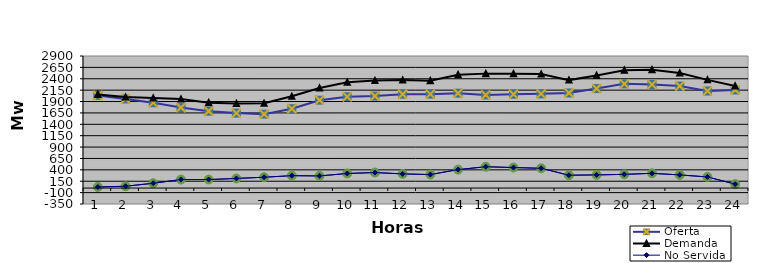
| Category | Oferta | No Servida | Demanda |
|---|---|---|---|
| 1.0 | 2032.75 | 24.325 | 2057.075 |
| 2.0 | 1957.25 | 40.034 | 1997.284 |
| 3.0 | 1873.22 | 105.568 | 1978.788 |
| 4.0 | 1766.88 | 186.701 | 1953.581 |
| 5.0 | 1687.39 | 186.838 | 1874.228 |
| 6.0 | 1646.33 | 211.289 | 1857.619 |
| 7.0 | 1622.59 | 238.065 | 1860.655 |
| 8.0 | 1743.58 | 272.159 | 2015.739 |
| 9.0 | 1929.88 | 265.984 | 2195.864 |
| 10.0 | 2004.49 | 320.357 | 2324.847 |
| 11.0 | 2019.59 | 340.464 | 2360.054 |
| 12.0 | 2060.11 | 310.926 | 2371.036 |
| 13.0 | 2062.4 | 296.601 | 2359.001 |
| 14.0 | 2083.51 | 405.683 | 2489.193 |
| 15.0 | 2044.63 | 468.326 | 2512.956 |
| 16.0 | 2059.7 | 450.787 | 2510.487 |
| 17.0 | 2068.33 | 434.073 | 2502.403 |
| 18.0 | 2088.26 | 282.32 | 2370.58 |
| 19.0 | 2185.14 | 288.712 | 2473.852 |
| 20.0 | 2287.96 | 300.912 | 2588.872 |
| 21.0 | 2274.43 | 323.774 | 2598.204 |
| 22.0 | 2238.84 | 288.613 | 2527.453 |
| 23.0 | 2131.37 | 244.487 | 2375.857 |
| 24.0 | 2154.42 | 86.483 | 2240.903 |